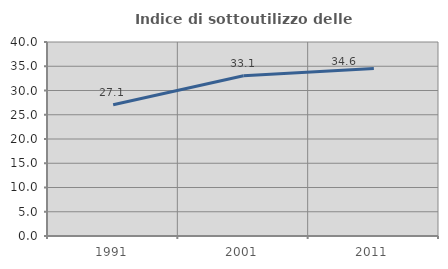
| Category | Indice di sottoutilizzo delle abitazioni  |
|---|---|
| 1991.0 | 27.053 |
| 2001.0 | 33.054 |
| 2011.0 | 34.553 |